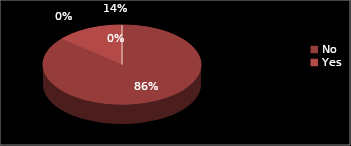
| Category | Series 0 |
|---|---|
| No | 44 |
| Yes | 7 |